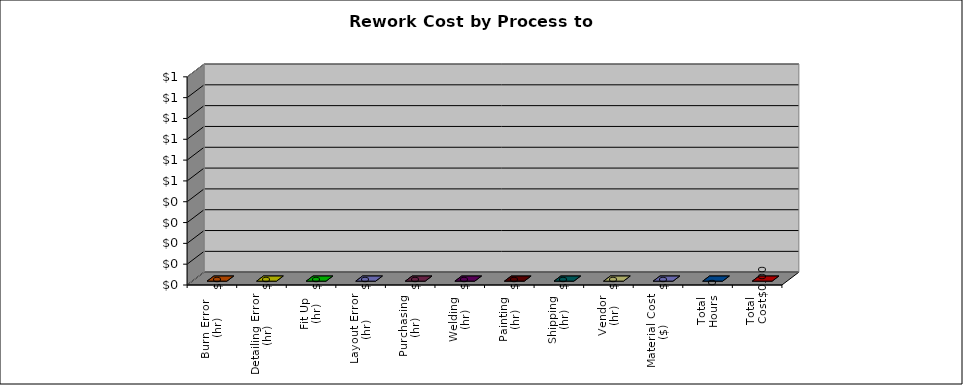
| Category | Total
Cost |
|---|---|
| Burn Error  
(hr) | 0 |
| Detailing Error
(hr) | 0 |
| Fit Up
(hr) | 0 |
| Layout Error
(hr) | 0 |
| Purchasing
(hr) | 0 |
| Welding
(hr) | 0 |
| Painting
(hr) | 0 |
| Shipping
(hr) | 0 |
| Vendor
(hr) | 0 |
| Material Cost
($) | 0 |
| Total
Hours | 0 |
| Total
Cost | 0 |